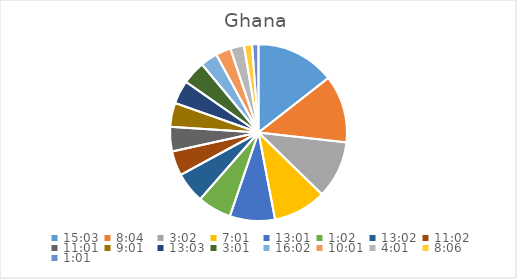
| Category | Series 0 |
|---|---|
| 0.6270833333333333 | 15.245 |
| 0.3361111111111111 | 13.042 |
| 0.12638888888888888 | 11.07 |
| 0.2923611111111111 | 10.256 |
| 0.5423611111111112 | 8.7 |
| 0.04305555555555556 | 6.549 |
| 0.5430555555555555 | 5.918 |
| 0.4597222222222222 | 4.745 |
| 0.4590277777777778 | 4.729 |
| 0.3756944444444445 | 4.629 |
| 0.5437500000000001 | 4.53 |
| 0.12569444444444444 | 4.514 |
| 0.6680555555555556 | 3.291 |
| 0.4173611111111111 | 2.906 |
| 0.1673611111111111 | 2.651 |
| 0.33749999999999997 | 1.549 |
| 0.042361111111111106 | 1.238 |